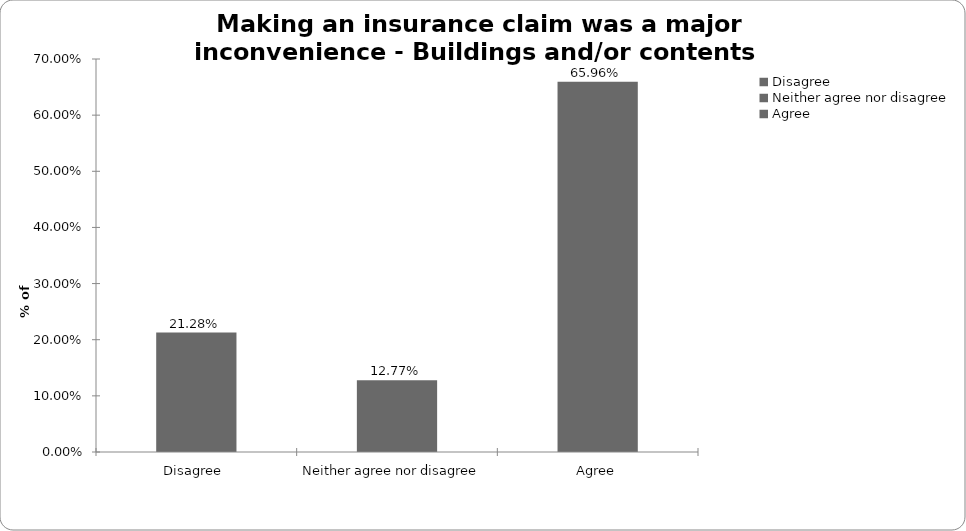
| Category | Buildings and/or conents |
|---|---|
| Disagree  | 0.213 |
| Neither agree nor disagree  | 0.128 |
| Agree | 0.66 |